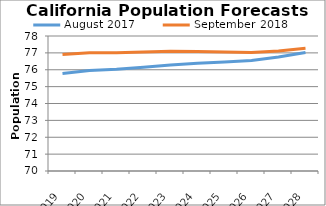
| Category | August 2017 | September 2018 |
|---|---|---|
| 2019.0 | 75.776 | 76.9 |
| 2020.0 | 75.951 | 77.012 |
| 2021.0 | 76.028 | 77.015 |
| 2022.0 | 76.15 | 77.055 |
| 2023.0 | 76.278 | 77.091 |
| 2024.0 | 76.379 | 77.087 |
| 2025.0 | 76.46 | 77.053 |
| 2026.0 | 76.549 | 77.018 |
| 2027.0 | 76.759 | 77.115 |
| 2028.0 | 77.027 | 77.28 |